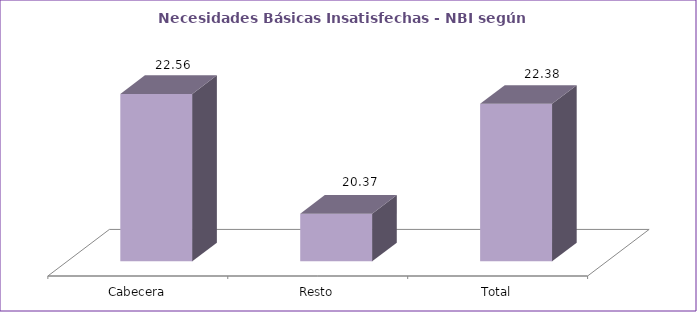
| Category | Series 0 |
|---|---|
| Cabecera | 22.56 |
| Resto | 20.37 |
| Total | 22.38 |